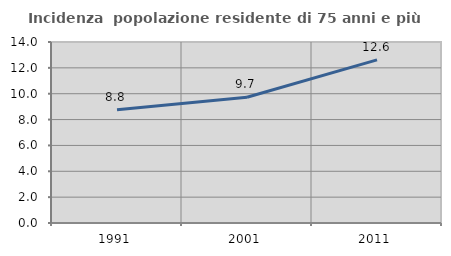
| Category | Incidenza  popolazione residente di 75 anni e più |
|---|---|
| 1991.0 | 8.761 |
| 2001.0 | 9.725 |
| 2011.0 | 12.616 |